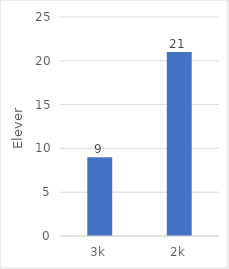
| Category | Series 0 |
|---|---|
| 3k | 9 |
| 2k | 21 |